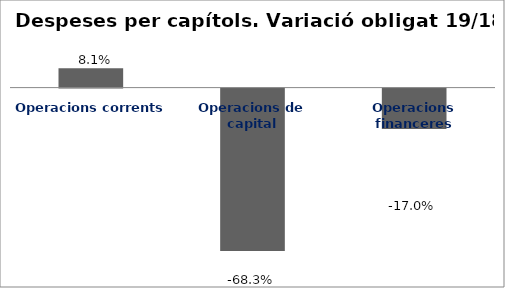
| Category | Series 0 |
|---|---|
| Operacions corrents | 0.081 |
| Operacions de capital | -0.683 |
| Operacions financeres | -0.17 |